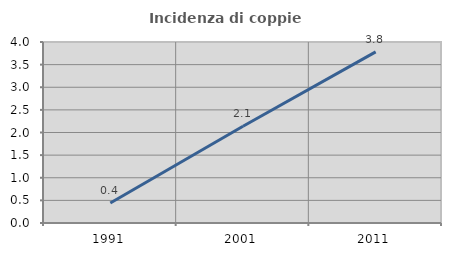
| Category | Incidenza di coppie miste |
|---|---|
| 1991.0 | 0.442 |
| 2001.0 | 2.137 |
| 2011.0 | 3.782 |